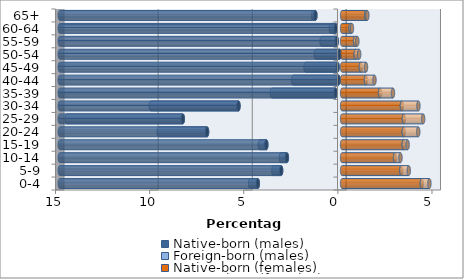
| Category | Native-born (males) | Foreign-born (males) | Native-born (females) | Foreign-born (females) |
|---|---|---|---|---|
| 0-4 | -4.479 | -0.403 | 4.235 | 0.401 |
| 5-9 | -3.24 | -0.41 | 3.147 | 0.392 |
| 10-14 | -2.935 | -0.314 | 2.811 | 0.288 |
| 15-19 | -4.027 | -0.342 | 3.272 | 0.208 |
| 20-24 | -7.174 | -2.567 | 3.274 | 0.77 |
| 25-29 | -8.463 | -6.169 | 3.283 | 1.021 |
| 30-34 | -5.506 | -4.654 | 3.177 | 0.876 |
| 35-39 | -0.346 | -3.383 | 2.015 | 0.687 |
| 40-44 | -0.193 | -2.412 | 1.265 | 0.453 |
| 45-49 | -0.24 | -1.702 | 0.994 | 0.275 |
| 50-54 | -0.127 | -1.269 | 0.725 | 0.182 |
| 55-59 | -0.288 | -0.798 | 0.688 | 0.121 |
| 60-64 | -0.336 | -0.261 | 0.445 | 0.077 |
| 65+ | -1.42 | -0.119 | 1.279 | 0.06 |